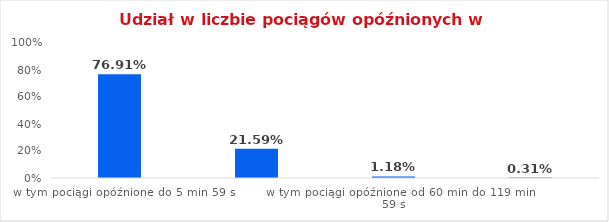
| Category | Series 0 |
|---|---|
| w tym pociągi opóźnione do 5 min 59 s | 0.769 |
| w tym pociągi opóźnione od 6 min do 59 min 59 s | 0.216 |
| w tym pociągi opóźnione od 60 min do 119 min 59 s | 0.012 |
| w tym pociągi opóźnione od 120 min | 0.003 |